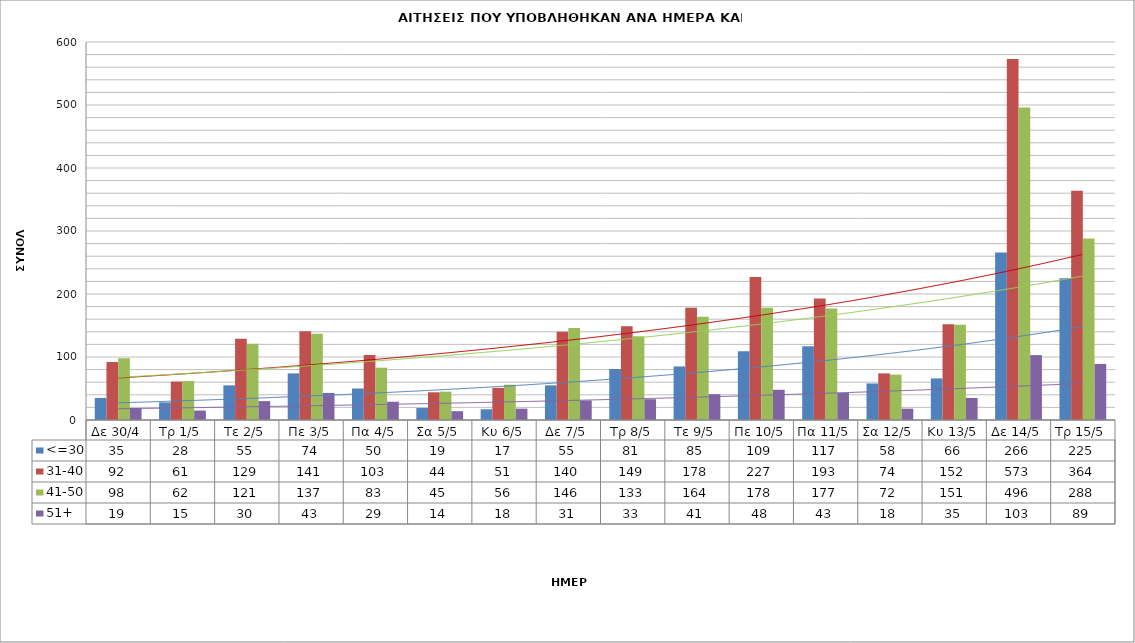
| Category | <=30 | 31-40 | 41-50 | 51+ |
|---|---|---|---|---|
| Δε 30/4 | 35 | 92 | 98 | 19 |
| Τρ 1/5 | 28 | 61 | 62 | 15 |
| Τε 2/5 | 55 | 129 | 121 | 30 |
| Πε 3/5 | 74 | 141 | 137 | 43 |
| Πα 4/5 | 50 | 103 | 83 | 29 |
| Σα 5/5 | 19 | 44 | 45 | 14 |
| Κυ 6/5 | 17 | 51 | 56 | 18 |
| Δε 7/5 | 55 | 140 | 146 | 31 |
| Τρ 8/5 | 81 | 149 | 133 | 33 |
| Τε 9/5 | 85 | 178 | 164 | 41 |
| Πε 10/5 | 109 | 227 | 178 | 48 |
| Πα 11/5 | 117 | 193 | 177 | 43 |
| Σα 12/5 | 58 | 74 | 72 | 18 |
| Κυ 13/5 | 66 | 152 | 151 | 35 |
| Δε 14/5 | 266 | 573 | 496 | 103 |
| Τρ 15/5 | 225 | 364 | 288 | 89 |